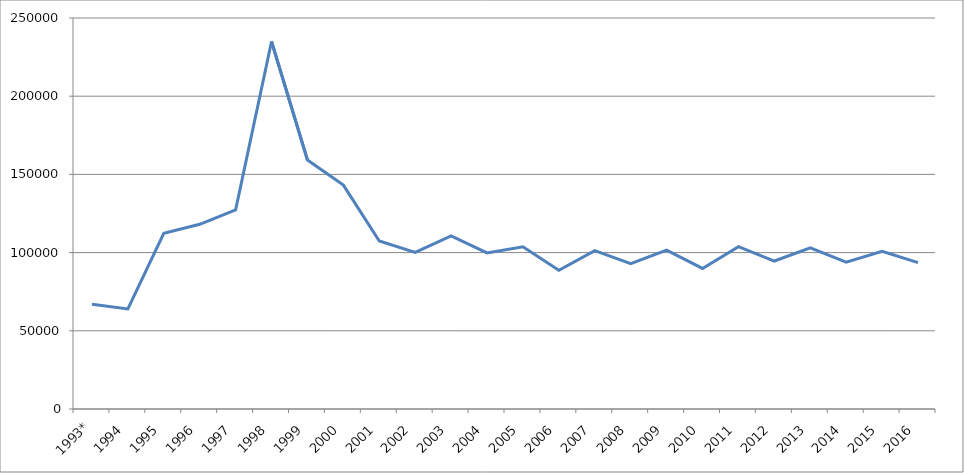
| Category | Series 0 |
|---|---|
| 1993* | 67019 |
| 1994 | 63973 |
| 1995 | 112356 |
| 1996 | 118097 |
| 1997 | 127345 |
| 1998 | 234939 |
| 1999 | 159169 |
| 2000 | 143130 |
| 2001 | 107434 |
| 2002 | 100117.6 |
| 2003 | 110735.7 |
| 2004 | 99783 |
| 2005 | 103714 |
| 2006 | 88741.7 |
| 2007 | 101249.02 |
| 2008 | 92975.7 |
| 2009 | 101618.2 |
| 2010 | 89863.4 |
| 2011 | 103797.2 |
| 2012 | 94614.9 |
| 2013 | 103098.5 |
| 2014 | 93855 |
| 2015 | 100804.8 |
| 2016 | 93549.2 |